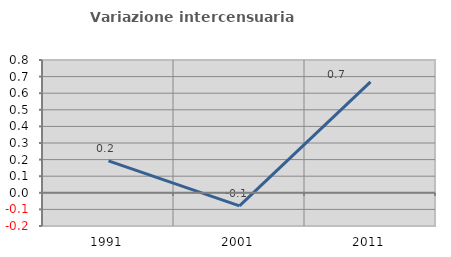
| Category | Variazione intercensuaria annua |
|---|---|
| 1991.0 | 0.192 |
| 2001.0 | -0.079 |
| 2011.0 | 0.668 |